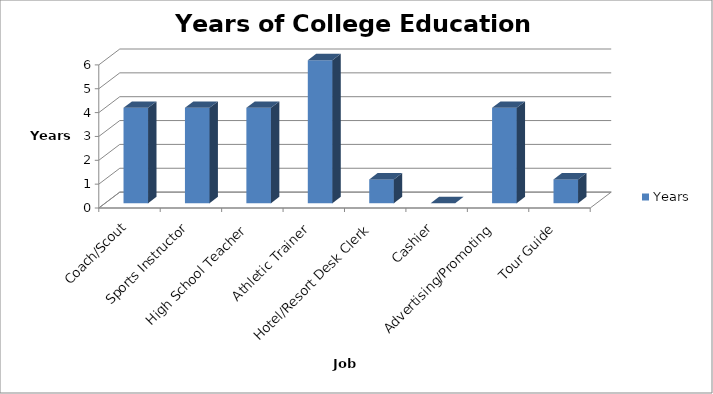
| Category | Years  |
|---|---|
| Coach/Scout | 4 |
| Sports Instructor | 4 |
| High School Teacher | 4 |
| Athletic Trainer | 6 |
| Hotel/Resort Desk Clerk | 1 |
| Cashier | 0 |
| Advertising/Promoting | 4 |
| Tour Guide | 1 |